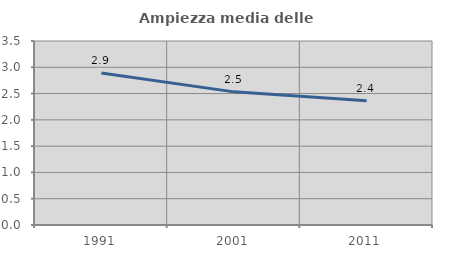
| Category | Ampiezza media delle famiglie |
|---|---|
| 1991.0 | 2.892 |
| 2001.0 | 2.532 |
| 2011.0 | 2.366 |